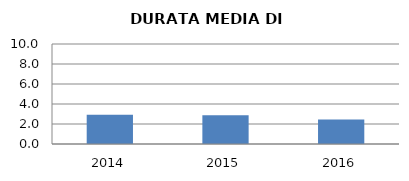
| Category | 2014 2015 2016 |
|---|---|
| 2014.0 | 2.926 |
| 2015.0 | 2.882 |
| 2016.0 | 2.452 |